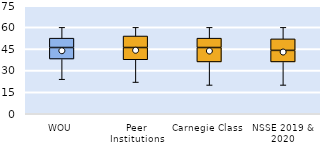
| Category | 25th | 50th | 75th |
|---|---|---|---|
| WOU | 38 | 8 | 6.5 |
| Peer Institutions | 37.5 | 8.5 | 8 |
| Carnegie Class | 36 | 10 | 6.5 |
| NSSE 2019 & 2020 | 36 | 8 | 8 |